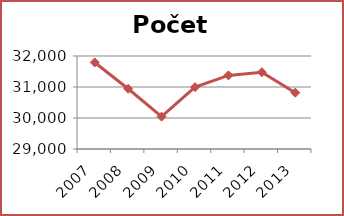
| Category | Počet čtenářů |
|---|---|
| 2007.0 | 31792 |
| 2008.0 | 30943 |
| 2009.0 | 30045 |
| 2010.0 | 30994 |
| 2011.0 | 31374 |
| 2012.0 | 31477 |
| 2013.0 | 30816 |